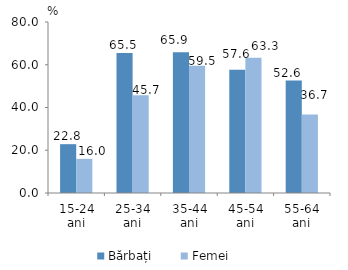
| Category | Bărbați | Femei |
|---|---|---|
| 15-24 ani | 22.844 | 15.964 |
| 25-34 ani | 65.461 | 45.73 |
| 35-44 ani | 65.878 | 59.507 |
| 45-54 ani | 57.607 | 63.325 |
| 55-64 ani | 52.624 | 36.719 |